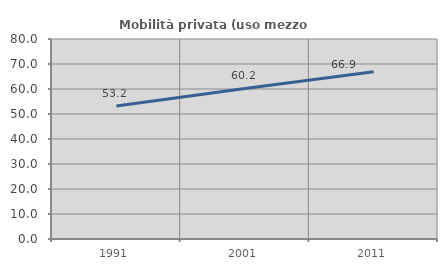
| Category | Mobilità privata (uso mezzo privato) |
|---|---|
| 1991.0 | 53.161 |
| 2001.0 | 60.21 |
| 2011.0 | 66.911 |